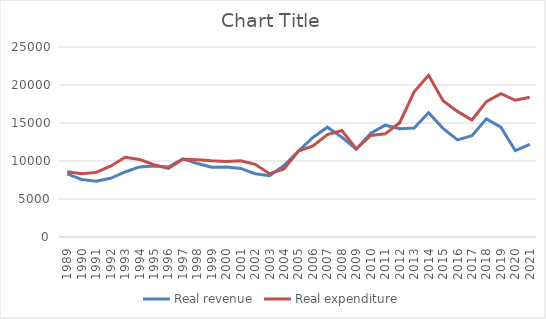
| Category | Real revenue | Real expenditure |
|---|---|---|
| 1989.0 | 8302.369 | 8590.606 |
| 1990.0 | 7571.228 | 8338.381 |
| 1991.0 | 7345.142 | 8501.812 |
| 1992.0 | 7723.031 | 9320.473 |
| 1993.0 | 8554.618 | 10492.104 |
| 1994.0 | 9226.148 | 10203.61 |
| 1995.0 | 9329.28 | 9510.273 |
| 1996.0 | 9212.017 | 9032.893 |
| 1997.0 | 10282.762 | 10237.929 |
| 1998.0 | 9673.76 | 10176.587 |
| 1999.0 | 9189.989 | 10020.987 |
| 2000.0 | 9208.986 | 9921.987 |
| 2001.0 | 9018.074 | 10035.75 |
| 2002.0 | 8323.879 | 9559.898 |
| 2003.0 | 8058.951 | 8333.39 |
| 2004.0 | 9404.085 | 8967.782 |
| 2005.0 | 11310.654 | 11294.304 |
| 2006.0 | 13091.461 | 11980.109 |
| 2007.0 | 14447.043 | 13468.23 |
| 2008.0 | 13121.771 | 14009.442 |
| 2009.0 | 11541.078 | 11603.37 |
| 2010.0 | 13667.891 | 13360.322 |
| 2011.0 | 14708.54 | 13576.578 |
| 2012.0 | 14242.558 | 15035.517 |
| 2013.0 | 14343.846 | 19094.887 |
| 2014.0 | 16355.47 | 21285.153 |
| 2015.0 | 14296.912 | 17916.65 |
| 2016.0 | 12768.854 | 16528.088 |
| 2017.0 | 13315.788 | 15389.336 |
| 2018.0 | 15543.021 | 17804.219 |
| 2019.0 | 14460.288 | 18870.092 |
| 2020.0 | 11359.1 | 17989.3 |
| 2021.0 | 12179.007 | 18376.57 |